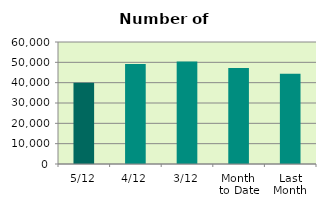
| Category | Series 0 |
|---|---|
| 5/12 | 39988 |
| 4/12 | 49200 |
| 3/12 | 50374 |
| Month 
to Date | 47259.5 |
| Last
Month | 44331.238 |